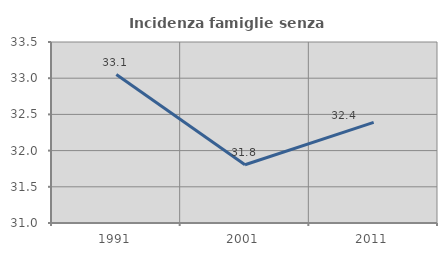
| Category | Incidenza famiglie senza nuclei |
|---|---|
| 1991.0 | 33.051 |
| 2001.0 | 31.805 |
| 2011.0 | 32.391 |